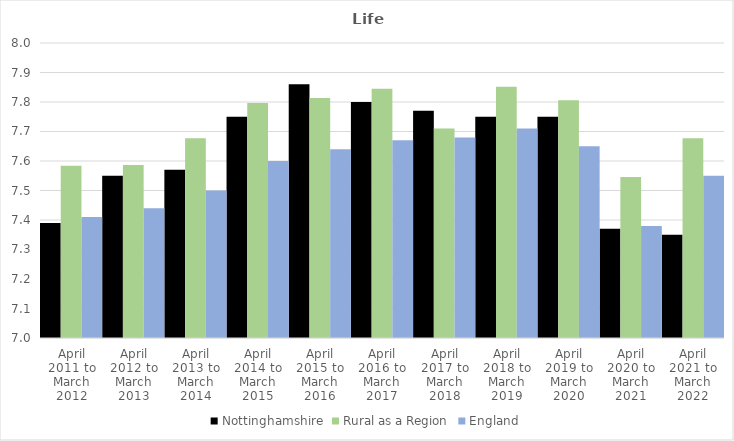
| Category | Nottinghamshire | Rural as a Region | England |
|---|---|---|---|
| April 2011 to March 2012 | 7.39 | 7.584 | 7.41 |
| April 2012 to March 2013 | 7.55 | 7.586 | 7.44 |
| April 2013 to March 2014 | 7.57 | 7.677 | 7.5 |
| April 2014 to March 2015 | 7.75 | 7.797 | 7.6 |
| April 2015 to March 2016 | 7.86 | 7.813 | 7.64 |
| April 2016 to March 2017 | 7.8 | 7.845 | 7.67 |
| April 2017 to March 2018 | 7.77 | 7.71 | 7.68 |
| April 2018 to March 2019 | 7.75 | 7.852 | 7.71 |
| April 2019 to March 2020 | 7.75 | 7.806 | 7.65 |
| April 2020 to March 2021 | 7.37 | 7.546 | 7.38 |
| April 2021 to March 2022 | 7.35 | 7.677 | 7.55 |